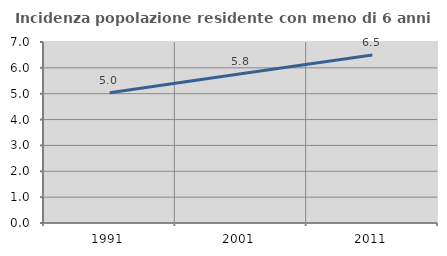
| Category | Incidenza popolazione residente con meno di 6 anni |
|---|---|
| 1991.0 | 5.033 |
| 2001.0 | 5.772 |
| 2011.0 | 6.499 |